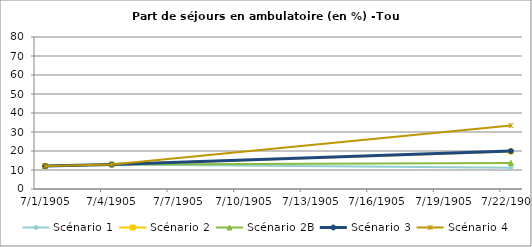
| Category | Scénario 1 | Scénario 2 | Scénario 2B | Scénario 3 | Scénario 4 |
|---|---|---|---|---|---|
| 2009.0 | 12.068 | 12.068 | 12.068 | 12.068 | 12.068 |
| 2012.0 | 12.913 | 12.913 | 12.913 | 12.913 | 12.913 |
| 2030.0 | 11.219 | 19.699 | 13.741 | 19.943 | 33.368 |